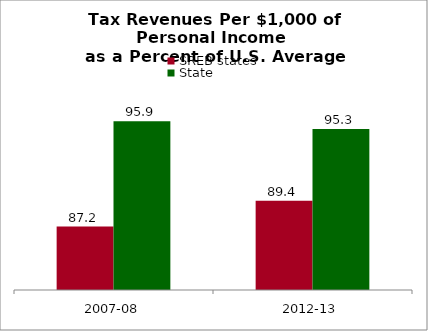
| Category | SREB states | State |
|---|---|---|
| 2007-08 | 87.237 | 95.924 |
| 2012-13 | 89.368 | 95.288 |